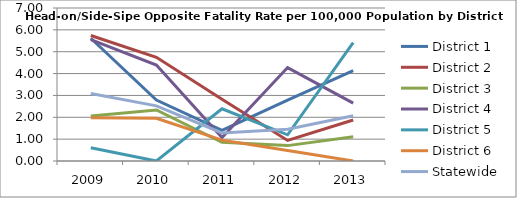
| Category | District 1 | District 2 | District 3 | District 4 | District 5 | District 6 | Statewide |
|---|---|---|---|---|---|---|---|
| 2009.0 | 5.616 | 5.742 | 2.057 | 5.556 | 0.608 | 1.976 | 3.084 |
| 2010.0 | 2.788 | 4.743 | 2.333 | 4.387 | 0 | 1.956 | 2.523 |
| 2011.0 | 1.398 | 2.824 | 0.857 | 1.069 | 2.391 | 0.956 | 1.282 |
| 2012.0 | 2.785 | 0.939 | 0.704 | 4.274 | 1.199 | 0.477 | 1.451 |
| 2013.0 | 4.137 | 1.876 | 1.107 | 2.647 | 5.417 | 0 | 2.068 |